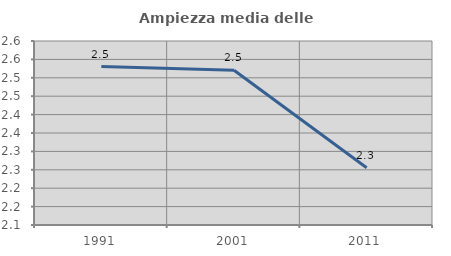
| Category | Ampiezza media delle famiglie |
|---|---|
| 1991.0 | 2.531 |
| 2001.0 | 2.521 |
| 2011.0 | 2.256 |